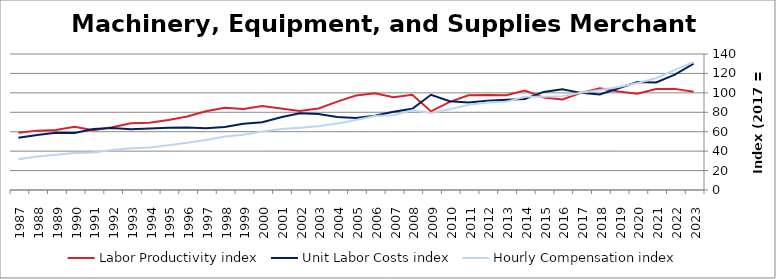
| Category | Labor Productivity index | Unit Labor Costs index | Hourly Compensation index |
|---|---|---|---|
| 2023.0 | 101.241 | 130.18 | 131.795 |
| 2022.0 | 104.094 | 118.759 | 123.621 |
| 2021.0 | 104.053 | 110.62 | 115.103 |
| 2020.0 | 99.209 | 111.108 | 110.229 |
| 2019.0 | 101.335 | 104.688 | 106.086 |
| 2018.0 | 104.718 | 98.324 | 102.963 |
| 2017.0 | 100 | 100 | 100 |
| 2016.0 | 93.182 | 103.705 | 96.635 |
| 2015.0 | 95.154 | 100.984 | 96.09 |
| 2014.0 | 102.285 | 93.74 | 95.882 |
| 2013.0 | 97.648 | 92.901 | 90.716 |
| 2012.0 | 97.878 | 91.914 | 89.964 |
| 2011.0 | 97.432 | 90.042 | 87.729 |
| 2010.0 | 90.754 | 91.474 | 83.016 |
| 2009.0 | 80.933 | 98.027 | 79.336 |
| 2008.0 | 98.122 | 83.584 | 82.014 |
| 2007.0 | 95.578 | 80.63 | 77.064 |
| 2006.0 | 99.613 | 76.363 | 76.068 |
| 2005.0 | 97.267 | 74.15 | 72.124 |
| 2004.0 | 91.03 | 75.129 | 68.39 |
| 2003.0 | 83.914 | 78.333 | 65.732 |
| 2002.0 | 81.251 | 78.903 | 64.11 |
| 2001.0 | 83.828 | 74.92 | 62.804 |
| 2000.0 | 86.365 | 69.806 | 60.288 |
| 1999.0 | 83.499 | 68.088 | 56.853 |
| 1998.0 | 84.622 | 64.948 | 54.96 |
| 1997.0 | 81.016 | 63.592 | 51.52 |
| 1996.0 | 75.694 | 64.354 | 48.712 |
| 1995.0 | 72.163 | 64.001 | 46.185 |
| 1994.0 | 69.333 | 63.225 | 43.836 |
| 1993.0 | 68.797 | 62.539 | 43.025 |
| 1992.0 | 64.644 | 63.809 | 41.248 |
| 1991.0 | 61.437 | 62.706 | 38.524 |
| 1990.0 | 64.975 | 58.634 | 38.098 |
| 1989.0 | 61.757 | 58.942 | 36.401 |
| 1988.0 | 61.116 | 56.513 | 34.539 |
| 1987.0 | 59.051 | 53.713 | 31.718 |